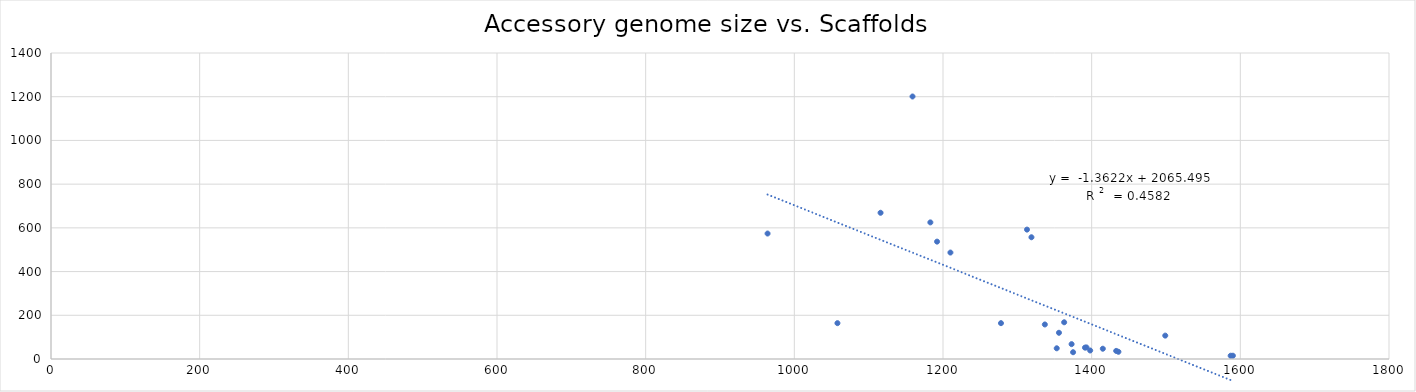
| Category | Series 0 |
|---|---|
| 1433.0 | 37 |
| 1319.0 | 557 |
| 1415.0 | 47 |
| 1313.0 | 592 |
| 1363.0 | 168 |
| 1159.0 | 1201 |
| 1183.0 | 625 |
| 1391.0 | 52 |
| 1375.0 | 31 |
| 1436.0 | 33 |
| 1393.0 | 53 |
| 1398.0 | 39 |
| 1499.0 | 107 |
| 1058.0 | 164 |
| 1337.0 | 158 |
| 1192.0 | 537 |
| 1373.0 | 68 |
| 1590.0 | 15 |
| 1587.0 | 15 |
| 1210.0 | 487 |
| 964.0 | 574 |
| 1356.0 | 120 |
| 1353.0 | 49 |
| 1116.0 | 669 |
| 1278.0 | 164 |